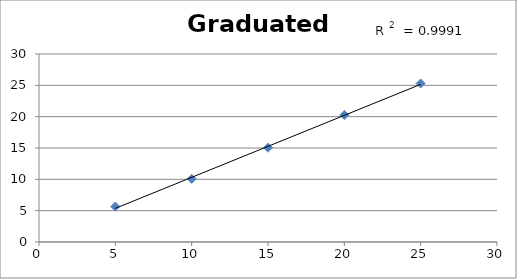
| Category | Mass of Water (g) |
|---|---|
| 5.0 | 5.65 |
| 10.0 | 10.07 |
| 15.0 | 15.04 |
| 20.0 | 20.26 |
| 25.0 | 25.29 |